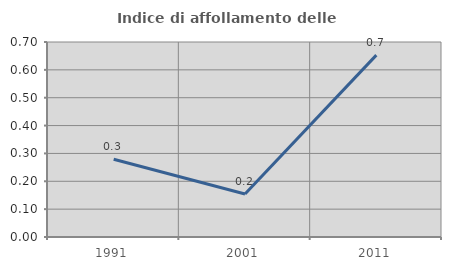
| Category | Indice di affollamento delle abitazioni  |
|---|---|
| 1991.0 | 0.279 |
| 2001.0 | 0.154 |
| 2011.0 | 0.653 |